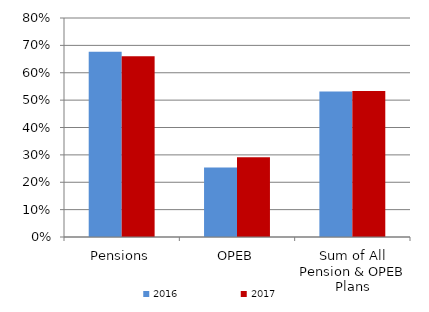
| Category | 2016 | 2017 |
|---|---|---|
|  Pensions  | 0.677 | 0.66 |
|  OPEB  | 0.254 | 0.291 |
|  Sum of All Pension & OPEB Plans  | 0.531 | 0.533 |